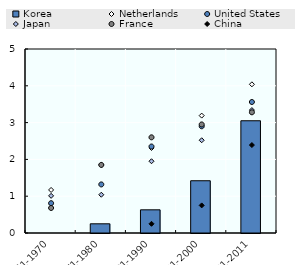
| Category | Korea |
|---|---|
| 1961-1970 | 0 |
| 1971-1980 | 0.25 |
| 1981-1990 | 0.63 |
| 1991-2000 | 1.42 |
| 2001-2011 | 3.05 |